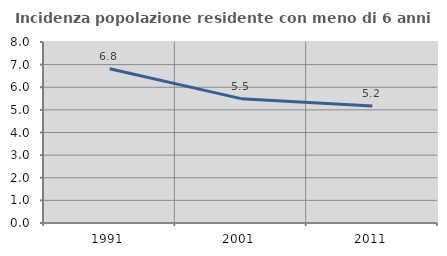
| Category | Incidenza popolazione residente con meno di 6 anni |
|---|---|
| 1991.0 | 6.821 |
| 2001.0 | 5.497 |
| 2011.0 | 5.168 |